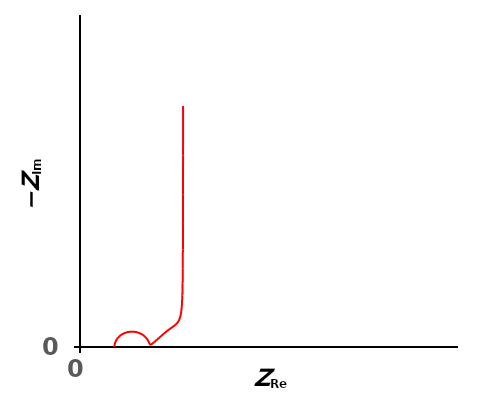
| Category | EDLC |
|---|---|
| 10.0034802717265 | 0.019 |
| 10.003916653768 | 0.024 |
| 10.0044131400657 | 0.03 |
| 10.0049810752832 | 0.037 |
| 10.0056355340634 | 0.045 |
| 10.006397147866 | 0.056 |
| 10.0072949565841 | 0.07 |
| 10.0083708783416 | 0.087 |
| 10.0096867362254 | 0.109 |
| 10.0113353263672 | 0.136 |
| 10.0134578724356 | 0.17 |
| 10.016271565329 | 0.213 |
| 10.0201130066904 | 0.266 |
| 10.0255066704005 | 0.333 |
| 10.0332725591956 | 0.416 |
| 10.044694859422 | 0.521 |
| 10.061784496463 | 0.653 |
| 10.0876836615279 | 0.817 |
| 10.1272785470628 | 1.022 |
| 10.1881013924775 | 1.275 |
| 10.2815946452657 | 1.587 |
| 10.4247284050349 | 1.965 |
| 10.6417014341039 | 2.415 |
| 10.9648443353786 | 2.933 |
| 11.4327545725431 | 3.502 |
| 12.0825217418732 | 4.077 |
| 12.9335097293833 | 4.59 |
| 13.9658792067445 | 4.952 |
| 15.107739123864 | 5.087 |
| 16.2486048769582 | 4.963 |
| 17.2788228463082 | 4.614 |
| 18.1284015323887 | 4.118 |
| 18.7793430992333 | 3.564 |
| 19.2521392317725 | 3.019 |
| 19.5843101244861 | 2.527 |
| 19.8144949954008 | 2.106 |
| 19.9749539795553 | 1.758 |
| 20.0898566220233 | 1.479 |
| 20.1762441761202 | 1.26 |
| 20.2457419641654 | 1.094 |
| 20.3061709735431 | 0.971 |
| 20.3628035066669 | 0.886 |
| 20.4192593857849 | 0.831 |
| 20.478116751439 | 0.803 |
| 20.5413183304424 | 0.798 |
| 20.6104388484638 | 0.813 |
| 20.6868611570424 | 0.847 |
| 20.7718936385341 | 0.899 |
| 20.8668505115356 | 0.967 |
| 20.9731091621152 | 1.053 |
| 21.0921536619972 | 1.155 |
| 21.2256104156531 | 1.276 |
| 21.3752798178694 | 1.415 |
| 21.5431665162761 | 1.575 |
| 21.7315101096607 | 1.757 |
| 21.9428159611746 | 1.963 |
| 22.1798932076028 | 2.196 |
| 22.4459243987274 | 2.458 |
| 22.7444393433923 | 2.754 |
| 23.0789831474938 | 3.087 |
| 23.453283912526 | 3.461 |
| 23.8735371001154 | 3.885 |
| 24.3516252770967 | 4.366 |
| 24.9038071725338 | 4.901 |
| 25.5405389432952 | 5.477 |
| 26.2509381097541 | 6.069 |
| 26.9938446880766 | 6.666 |
| 27.7070327711669 | 7.291 |
| 28.3317032948258 | 8.013 |
| 28.8341868902178 | 8.934 |
| 29.2106988953738 | 10.175 |
| 29.4778749349956 | 11.859 |
| 29.6601673843618 | 14.118 |
| 29.7812212635897 | 17.096 |
| 29.86016542349 | 20.969 |
| 29.9110404160914 | 25.949 |
| 29.9435757027386 | 32.306 |
| 29.9642803720763 | 40.382 |
| 29.9774150813197 | 50.607 |
| 29.9857309607845 | 63.526 |
| 29.9909892965847 | 79.829 |